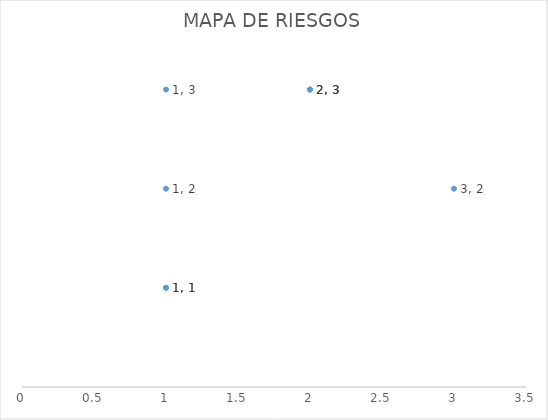
| Category | Series 0 |
|---|---|
| 3.0 | 2 |
| 1.0 | 1 |
| 2.0 | 3 |
| 2.0 | 3 |
| 1.0 | 1 |
| 1.0 | 2 |
| 2.0 | 3 |
| 1.0 | 3 |